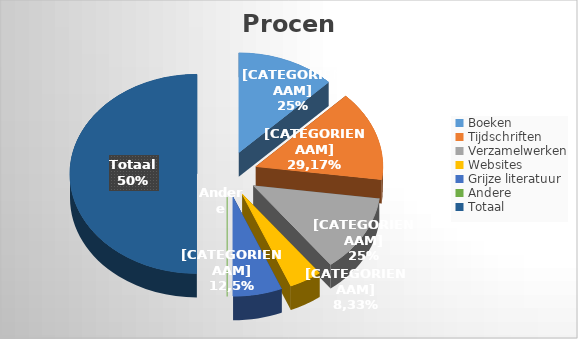
| Category | Aantal | Procent |
|---|---|---|
| Boeken | 6 | 0.25 |
| Tijdschriften | 7 | 0.292 |
| Verzamelwerken | 6 | 0.25 |
| Websites | 2 | 0.083 |
| Grijze literatuur | 3 | 0.125 |
| Andere | 0 | 0 |
| Totaal | 24 | 1 |